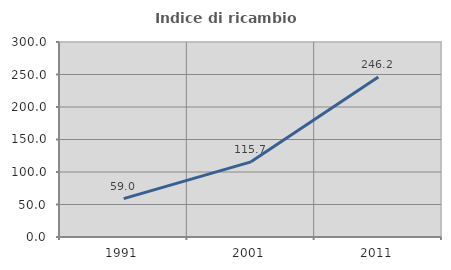
| Category | Indice di ricambio occupazionale  |
|---|---|
| 1991.0 | 59 |
| 2001.0 | 115.663 |
| 2011.0 | 246.154 |